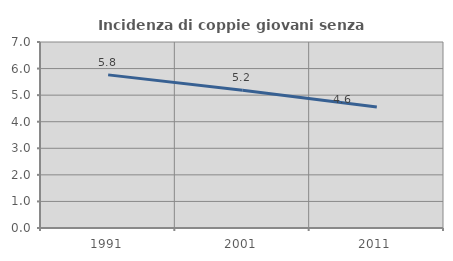
| Category | Incidenza di coppie giovani senza figli |
|---|---|
| 1991.0 | 5.763 |
| 2001.0 | 5.183 |
| 2011.0 | 4.557 |